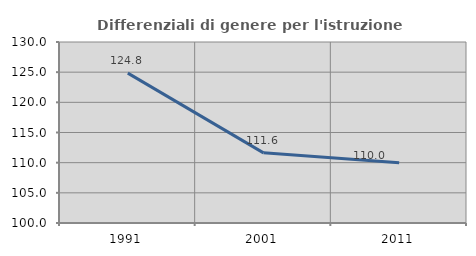
| Category | Differenziali di genere per l'istruzione superiore |
|---|---|
| 1991.0 | 124.84 |
| 2001.0 | 111.624 |
| 2011.0 | 109.996 |